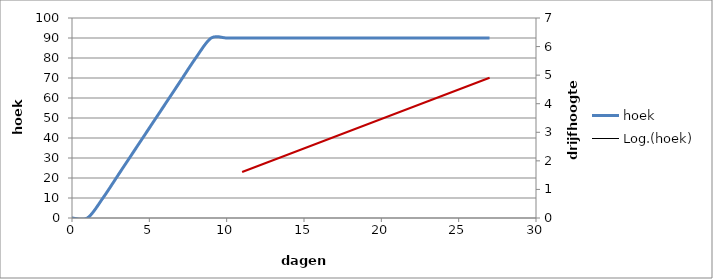
| Category | hoek |
|---|---|
| 0.0 | 0 |
| 1.0 | 0 |
| 2.0 | 10 |
| 3.0 | 21.667 |
| 4.0 | 33.333 |
| 5.0 | 45 |
| 6.0 | 56.667 |
| 7.0 | 68.333 |
| 8.0 | 80 |
| 9.0 | 90 |
| 10.0 | 90 |
| 11.0 | 90 |
| 12.0 | 90 |
| 13.0 | 90 |
| 14.0 | 90 |
| 15.0 | 90 |
| 16.0 | 90 |
| 17.0 | 90 |
| 18.0 | 90 |
| 19.0 | 90 |
| 20.0 | 90 |
| 21.0 | 90 |
| 22.0 | 90 |
| 23.0 | 90 |
| 24.0 | 90 |
| 25.0 | 90 |
| 26.0 | 90 |
| 27.0 | 90 |